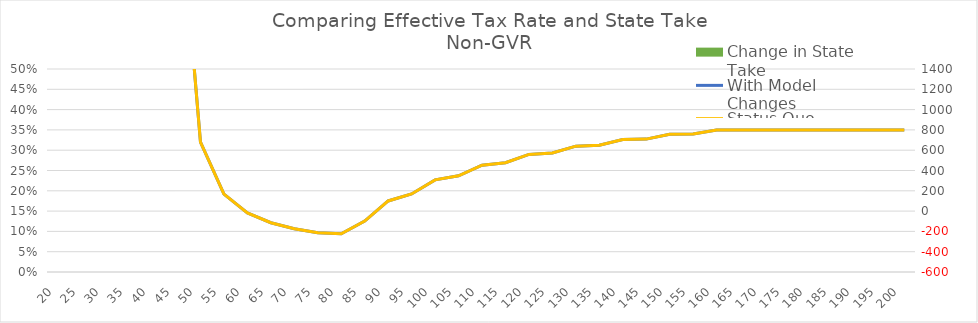
| Category | Change in State Take |
|---|---|
| 20.0 | 0 |
| 25.0 | 0 |
| 30.0 | 0 |
| 35.0 | 0 |
| 40.0 | 0 |
| 45.0 | 0 |
| 50.0 | 0 |
| 55.0 | 0 |
| 60.0 | 0 |
| 65.0 | 0 |
| 70.0 | 0 |
| 75.0 | 0 |
| 80.0 | 0 |
| 85.0 | 0 |
| 90.0 | 0 |
| 95.0 | 0 |
| 100.0 | 0 |
| 105.0 | 0 |
| 110.0 | 0 |
| 115.0 | 0 |
| 120.0 | 0 |
| 125.0 | 0 |
| 130.0 | 0 |
| 135.0 | 0 |
| 140.0 | 0 |
| 145.0 | 0 |
| 150.0 | 0 |
| 155.0 | 0 |
| 160.0 | 0 |
| 165.0 | 0 |
| 170.0 | 0 |
| 175.0 | 0 |
| 180.0 | 0 |
| 185.0 | 0 |
| 190.0 | 0 |
| 195.0 | 0 |
| 200.0 | 0 |